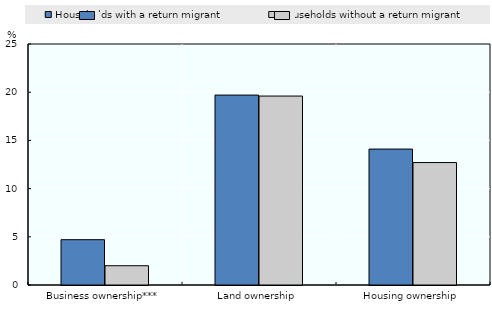
| Category | Households with a return migrant | Households without a return migrant |
|---|---|---|
| Business ownership*** | 4.7 | 2 |
| Land ownership | 19.7 | 19.6 |
| Housing ownership | 14.1 | 12.7 |